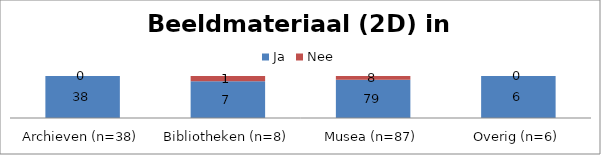
| Category | Ja | Nee |
|---|---|---|
| Archieven (n=38) | 38 | 0 |
| Bibliotheken (n=8) | 7 | 1 |
| Musea (n=87) | 79 | 8 |
| Overig (n=6) | 6 | 0 |